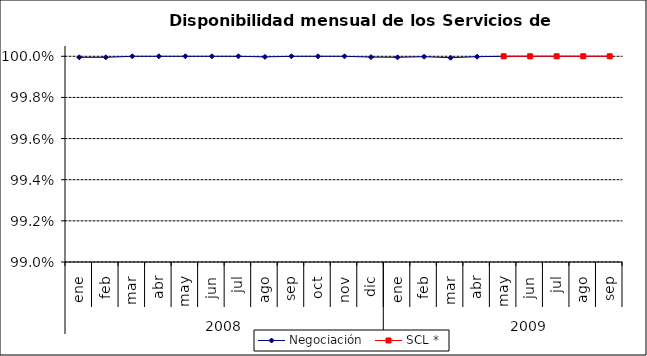
| Category | Negociación | SCL * |
|---|---|---|
| 0 | 1 | 0 |
| 1 | 1 | 0 |
| 2 | 1 | 0 |
| 3 | 1 | 0 |
| 4 | 1 | 0 |
| 5 | 1 | 0 |
| 6 | 1 | 0 |
| 7 | 1 | 0 |
| 8 | 1 | 0 |
| 9 | 1 | 0 |
| 10 | 1 | 0 |
| 11 | 1 | 0 |
| 12 | 1 | 0 |
| 13 | 1 | 0 |
| 14 | 1 | 0 |
| 15 | 1 | 0 |
| 16 | 1 | 1 |
| 17 | 1 | 1 |
| 18 | 1 | 1 |
| 19 | 1 | 1 |
| 20 | 1 | 1 |